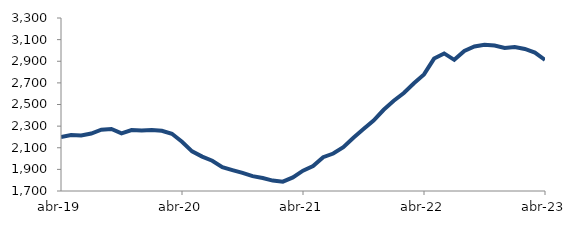
| Category | Series 0 |
|---|---|
| 2019-04-01 | 2199.941 |
| 2019-05-01 | 2218.125 |
| 2019-06-01 | 2213.708 |
| 2019-07-01 | 2231.834 |
| 2019-08-01 | 2267.321 |
| 2019-09-01 | 2273.768 |
| 2019-10-01 | 2233.304 |
| 2019-11-01 | 2263.898 |
| 2019-12-01 | 2259.926 |
| 2020-01-01 | 2265.053 |
| 2020-02-01 | 2256.766 |
| 2020-03-01 | 2229.161 |
| 2020-04-01 | 2155.791 |
| 2020-05-01 | 2066.843 |
| 2020-06-01 | 2018.026 |
| 2020-07-01 | 1979.558 |
| 2020-08-01 | 1920.368 |
| 2020-09-01 | 1893.237 |
| 2020-10-01 | 1867.4 |
| 2020-11-01 | 1837.195 |
| 2020-12-01 | 1819.546 |
| 2021-01-01 | 1796.45 |
| 2021-02-01 | 1786.603 |
| 2021-03-01 | 1826.072 |
| 2021-04-01 | 1887.798 |
| 2021-05-01 | 1930.372 |
| 2021-06-01 | 2012.926 |
| 2021-07-01 | 2046.434 |
| 2021-08-01 | 2105.806 |
| 2021-09-01 | 2192.514 |
| 2021-10-01 | 2272.972 |
| 2021-11-01 | 2351.334 |
| 2021-12-01 | 2451.171 |
| 2022-01-01 | 2534.613 |
| 2022-02-01 | 2606.357 |
| 2022-03-01 | 2696.948 |
| 2022-04-01 | 2778.264 |
| 2022-05-01 | 2924.682 |
| 2022-06-01 | 2972.281 |
| 2022-07-01 | 2912.933 |
| 2022-08-01 | 2994.913 |
| 2022-09-01 | 3036.467 |
| 2022-10-01 | 3052.236 |
| 2022-11-01 | 3044.767 |
| 2022-12-01 | 3023.141 |
| 2023-01-01 | 3030.956 |
| 2023-02-01 | 3013.674 |
| 2023-03-01 | 2979.861 |
| 2023-04-01 | 2913.014 |